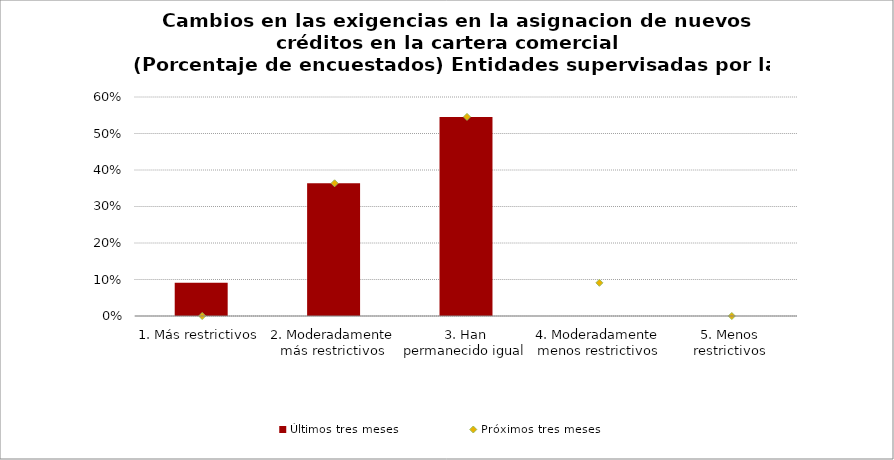
| Category | Últimos tres meses |
|---|---|
| 1. Más restrictivos | 0.091 |
| 2. Moderadamente más restrictivos | 0.364 |
| 3. Han permanecido igual | 0.546 |
| 4. Moderadamente menos restrictivos | 0 |
| 5. Menos restrictivos | 0 |